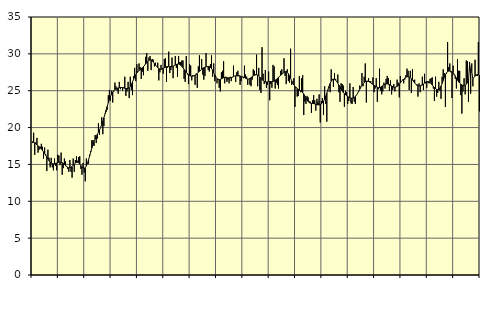
| Category | Piggar | Series 1 |
|---|---|---|
| nan | 17.9 | 18.08 |
| 87.0 | 19.3 | 17.99 |
| 87.0 | 16.3 | 17.92 |
| 87.0 | 18 | 17.77 |
| 87.0 | 18.6 | 17.65 |
| 87.0 | 16.6 | 17.52 |
| 87.0 | 17 | 17.39 |
| 87.0 | 17.4 | 17.25 |
| 87.0 | 17.8 | 17.09 |
| 87.0 | 17.4 | 16.91 |
| 87.0 | 15.8 | 16.71 |
| 87.0 | 17.3 | 16.48 |
| nan | 16.4 | 16.24 |
| 88.0 | 14.1 | 15.98 |
| 88.0 | 17 | 15.72 |
| 88.0 | 15.9 | 15.49 |
| 88.0 | 14.6 | 15.3 |
| 88.0 | 15.9 | 15.17 |
| 88.0 | 14.6 | 15.1 |
| 88.0 | 14.2 | 15.09 |
| 88.0 | 15.8 | 15.1 |
| 88.0 | 14.8 | 15.15 |
| 88.0 | 14.2 | 15.2 |
| 88.0 | 16.3 | 15.26 |
| nan | 16.2 | 15.29 |
| 89.0 | 14.9 | 15.31 |
| 89.0 | 16.6 | 15.29 |
| 89.0 | 13.6 | 15.23 |
| 89.0 | 14.5 | 15.14 |
| 89.0 | 15.8 | 15.01 |
| 89.0 | 15.4 | 14.86 |
| 89.0 | 14.8 | 14.73 |
| 89.0 | 14.4 | 14.61 |
| 89.0 | 14 | 14.54 |
| 89.0 | 15.6 | 14.55 |
| 89.0 | 14 | 14.61 |
| nan | 13.2 | 14.73 |
| 90.0 | 15.8 | 14.88 |
| 90.0 | 14 | 15.05 |
| 90.0 | 15.6 | 15.19 |
| 90.0 | 16.1 | 15.28 |
| 90.0 | 15.5 | 15.3 |
| 90.0 | 16 | 15.22 |
| 90.0 | 16.1 | 15.06 |
| 90.0 | 14.4 | 14.86 |
| 90.0 | 13.6 | 14.66 |
| 90.0 | 15.2 | 14.51 |
| 90.0 | 13.9 | 14.46 |
| nan | 12.7 | 14.56 |
| 91.0 | 15.8 | 14.8 |
| 91.0 | 15.1 | 15.17 |
| 91.0 | 15.1 | 15.64 |
| 91.0 | 16.3 | 16.16 |
| 91.0 | 16.8 | 16.69 |
| 91.0 | 18.3 | 17.21 |
| 91.0 | 18.3 | 17.68 |
| 91.0 | 17.5 | 18.09 |
| 91.0 | 19 | 18.46 |
| 91.0 | 17.9 | 18.79 |
| 91.0 | 18.5 | 19.08 |
| nan | 20.6 | 19.36 |
| 92.0 | 19 | 19.67 |
| 92.0 | 20 | 20.01 |
| 92.0 | 21.4 | 20.41 |
| 92.0 | 19.1 | 20.85 |
| 92.0 | 20.2 | 21.34 |
| 92.0 | 21.9 | 21.84 |
| 92.0 | 22.1 | 22.36 |
| 92.0 | 22.4 | 22.87 |
| 92.0 | 24.4 | 23.36 |
| 92.0 | 25.1 | 23.81 |
| 92.0 | 23.6 | 24.21 |
| nan | 25 | 24.55 |
| 93.0 | 23.4 | 24.81 |
| 93.0 | 24.9 | 25.01 |
| 93.0 | 26.1 | 25.15 |
| 93.0 | 25.6 | 25.24 |
| 93.0 | 25 | 25.32 |
| 93.0 | 24.6 | 25.38 |
| 93.0 | 26.2 | 25.41 |
| 93.0 | 25.2 | 25.44 |
| 93.0 | 25.4 | 25.45 |
| 93.0 | 25 | 25.42 |
| 93.0 | 25.5 | 25.37 |
| nan | 26.9 | 25.32 |
| 94.0 | 24.3 | 25.29 |
| 94.0 | 24.9 | 25.28 |
| 94.0 | 26.2 | 25.32 |
| 94.0 | 24 | 25.41 |
| 94.0 | 26.9 | 25.6 |
| 94.0 | 25.1 | 25.86 |
| 94.0 | 24.4 | 26.18 |
| 94.0 | 27 | 26.53 |
| 94.0 | 28.1 | 26.86 |
| 94.0 | 26.3 | 27.16 |
| 94.0 | 28.6 | 27.41 |
| nan | 27.7 | 27.6 |
| 95.0 | 28.7 | 27.76 |
| 95.0 | 28.2 | 27.88 |
| 95.0 | 26.6 | 28 |
| 95.0 | 27.6 | 28.12 |
| 95.0 | 27.1 | 28.26 |
| 95.0 | 28.5 | 28.43 |
| 95.0 | 29.6 | 28.62 |
| 95.0 | 30.1 | 28.82 |
| 95.0 | 27.7 | 28.99 |
| 95.0 | 29.5 | 29.12 |
| 95.0 | 29.7 | 29.18 |
| nan | 27.8 | 29.16 |
| 96.0 | 29.3 | 29.05 |
| 96.0 | 29.2 | 28.88 |
| 96.0 | 28.3 | 28.67 |
| 96.0 | 28.8 | 28.47 |
| 96.0 | 28.3 | 28.28 |
| 96.0 | 28.8 | 28.13 |
| 96.0 | 26.4 | 28.02 |
| 96.0 | 27.5 | 27.94 |
| 96.0 | 28.5 | 27.92 |
| 96.0 | 27.9 | 27.96 |
| 96.0 | 27.3 | 28.02 |
| nan | 29.3 | 28.09 |
| 97.0 | 29.4 | 28.18 |
| 97.0 | 26.2 | 28.24 |
| 97.0 | 28.1 | 28.29 |
| 97.0 | 30.3 | 28.31 |
| 97.0 | 27.4 | 28.3 |
| 97.0 | 27.8 | 28.28 |
| 97.0 | 29.5 | 28.28 |
| 97.0 | 26.7 | 28.32 |
| 97.0 | 28.4 | 28.39 |
| 97.0 | 29.7 | 28.48 |
| 97.0 | 28.1 | 28.56 |
| nan | 26.9 | 28.62 |
| 98.0 | 29.7 | 28.62 |
| 98.0 | 28.9 | 28.56 |
| 98.0 | 28.9 | 28.46 |
| 98.0 | 29.1 | 28.29 |
| 98.0 | 29.1 | 28.1 |
| 98.0 | 26.6 | 27.89 |
| 98.0 | 26.2 | 27.7 |
| 98.0 | 29.7 | 27.52 |
| 98.0 | 27.2 | 27.36 |
| 98.0 | 25.9 | 27.21 |
| 98.0 | 28.6 | 27.08 |
| nan | 28.4 | 26.99 |
| 99.0 | 26.4 | 26.96 |
| 99.0 | 27.1 | 26.98 |
| 99.0 | 27.1 | 27.03 |
| 99.0 | 25.8 | 27.11 |
| 99.0 | 27.3 | 27.2 |
| 99.0 | 25.4 | 27.33 |
| 99.0 | 28.3 | 27.49 |
| 99.0 | 29.8 | 27.65 |
| 99.0 | 27.7 | 27.8 |
| 99.0 | 29.3 | 27.94 |
| 99.0 | 27.2 | 28.05 |
| nan | 26.5 | 28.13 |
| 0.0 | 27 | 28.19 |
| 0.0 | 30.1 | 28.24 |
| 0.0 | 28.3 | 28.27 |
| 0.0 | 27.8 | 28.29 |
| 0.0 | 27.6 | 28.28 |
| 0.0 | 28.6 | 28.19 |
| 0.0 | 29.8 | 28.02 |
| 0.0 | 26.9 | 27.76 |
| 0.0 | 28.7 | 27.45 |
| 0.0 | 26.3 | 27.13 |
| 0.0 | 26.9 | 26.85 |
| nan | 26 | 26.65 |
| 1.0 | 26.6 | 26.54 |
| 1.0 | 25.4 | 26.51 |
| 1.0 | 24.9 | 26.54 |
| 1.0 | 27.5 | 26.61 |
| 1.0 | 27.7 | 26.69 |
| 1.0 | 29 | 26.76 |
| 1.0 | 26 | 26.8 |
| 1.0 | 26.9 | 26.8 |
| 1.0 | 26.2 | 26.77 |
| 1.0 | 26.5 | 26.74 |
| 1.0 | 26 | 26.72 |
| nan | 26.9 | 26.74 |
| 2.0 | 26.3 | 26.79 |
| 2.0 | 26.8 | 26.85 |
| 2.0 | 28.4 | 26.93 |
| 2.0 | 27 | 26.99 |
| 2.0 | 26.2 | 27.02 |
| 2.0 | 27.5 | 27.03 |
| 2.0 | 27.7 | 27.01 |
| 2.0 | 27.1 | 27 |
| 2.0 | 25.8 | 26.98 |
| 2.0 | 26.3 | 26.95 |
| 2.0 | 26.9 | 26.91 |
| nan | 26.7 | 26.85 |
| 3.0 | 28.4 | 26.77 |
| 3.0 | 27.2 | 26.69 |
| 3.0 | 26.9 | 26.61 |
| 3.0 | 25.8 | 26.57 |
| 3.0 | 26.6 | 26.59 |
| 3.0 | 25.8 | 26.67 |
| 3.0 | 25.6 | 26.77 |
| 3.0 | 26.5 | 26.89 |
| 3.0 | 27.9 | 27.01 |
| 3.0 | 27.7 | 27.11 |
| 3.0 | 27.1 | 27.17 |
| nan | 29.9 | 27.17 |
| 4.0 | 25.6 | 27.11 |
| 4.0 | 28.1 | 27 |
| 4.0 | 25.1 | 26.86 |
| 4.0 | 24.7 | 26.69 |
| 4.0 | 30.9 | 26.52 |
| 4.0 | 27.3 | 26.37 |
| 4.0 | 25.9 | 26.26 |
| 4.0 | 27.8 | 26.2 |
| 4.0 | 25.4 | 26.19 |
| 4.0 | 25.8 | 26.2 |
| 4.0 | 27.6 | 26.23 |
| nan | 23.7 | 26.24 |
| 5.0 | 25.9 | 26.24 |
| 5.0 | 25.4 | 26.24 |
| 5.0 | 28.5 | 26.25 |
| 5.0 | 28.3 | 26.31 |
| 5.0 | 25.3 | 26.4 |
| 5.0 | 26.1 | 26.52 |
| 5.0 | 25.8 | 26.67 |
| 5.0 | 25.3 | 26.81 |
| 5.0 | 27 | 26.95 |
| 5.0 | 27.7 | 27.1 |
| 5.0 | 27.9 | 27.23 |
| nan | 27.4 | 27.37 |
| 6.0 | 29.4 | 27.5 |
| 6.0 | 27 | 27.59 |
| 6.0 | 25.9 | 27.6 |
| 6.0 | 27.9 | 27.5 |
| 6.0 | 26.3 | 27.3 |
| 6.0 | 26.1 | 27.03 |
| 6.0 | 30.7 | 26.7 |
| 6.0 | 25.8 | 26.36 |
| 6.0 | 26 | 26.06 |
| 6.0 | 26.7 | 25.8 |
| 6.0 | 22.8 | 25.58 |
| nan | 25.5 | 25.41 |
| 7.0 | 24.2 | 25.28 |
| 7.0 | 24.3 | 25.17 |
| 7.0 | 27 | 25.08 |
| 7.0 | 24.8 | 25.01 |
| 7.0 | 26.7 | 24.9 |
| 7.0 | 27.1 | 24.75 |
| 7.0 | 21.7 | 24.54 |
| 7.0 | 23.5 | 24.28 |
| 7.0 | 23.2 | 24.02 |
| 7.0 | 24.3 | 23.75 |
| 7.0 | 24.1 | 23.54 |
| nan | 23.6 | 23.4 |
| 8.0 | 23.5 | 23.32 |
| 8.0 | 22 | 23.29 |
| 8.0 | 23.7 | 23.27 |
| 8.0 | 24.4 | 23.25 |
| 8.0 | 23.7 | 23.21 |
| 8.0 | 22.3 | 23.16 |
| 8.0 | 23.9 | 23.1 |
| 8.0 | 23.5 | 23.08 |
| 8.0 | 24.5 | 23.08 |
| 8.0 | 20.7 | 23.1 |
| 8.0 | 23.6 | 23.19 |
| nan | 24 | 23.33 |
| 9.0 | 21.7 | 23.56 |
| 9.0 | 25.6 | 23.87 |
| 9.0 | 23.2 | 24.25 |
| 9.0 | 20.8 | 24.67 |
| 9.0 | 24.9 | 25.13 |
| 9.0 | 25.4 | 25.58 |
| 9.0 | 24.8 | 25.98 |
| 9.0 | 27.9 | 26.28 |
| 9.0 | 26.6 | 26.48 |
| 9.0 | 25.5 | 26.56 |
| 9.0 | 27.4 | 26.55 |
| nan | 26.6 | 26.44 |
| 10.0 | 26.2 | 26.26 |
| 10.0 | 27.2 | 26.03 |
| 10.0 | 24.8 | 25.76 |
| 10.0 | 23.5 | 25.48 |
| 10.0 | 26 | 25.22 |
| 10.0 | 25.9 | 24.98 |
| 10.0 | 25.7 | 24.77 |
| 10.0 | 22.8 | 24.6 |
| 10.0 | 25 | 24.45 |
| 10.0 | 24.8 | 24.33 |
| 10.0 | 23.2 | 24.22 |
| nan | 23.6 | 24.12 |
| 11.0 | 26 | 24.04 |
| 11.0 | 23.3 | 23.99 |
| 11.0 | 23.2 | 23.98 |
| 11.0 | 25.5 | 24.01 |
| 11.0 | 23.5 | 24.09 |
| 11.0 | 23.2 | 24.22 |
| 11.0 | 24.4 | 24.41 |
| 11.0 | 24.6 | 24.64 |
| 11.0 | 25 | 24.91 |
| 11.0 | 25.7 | 25.2 |
| 11.0 | 25.5 | 25.48 |
| nan | 27.4 | 25.73 |
| 12.0 | 25.6 | 25.95 |
| 12.0 | 26.9 | 26.12 |
| 12.0 | 28.7 | 26.23 |
| 12.0 | 23.4 | 26.3 |
| 12.0 | 26.2 | 26.3 |
| 12.0 | 26.7 | 26.25 |
| 12.0 | 26.3 | 26.18 |
| 12.0 | 26.3 | 26.08 |
| 12.0 | 25.9 | 25.97 |
| 12.0 | 26.8 | 25.86 |
| 12.0 | 24.8 | 25.75 |
| nan | 25.3 | 25.65 |
| 13.0 | 26.7 | 25.55 |
| 13.0 | 23.5 | 25.47 |
| 13.0 | 25.2 | 25.41 |
| 13.0 | 28 | 25.41 |
| 13.0 | 25 | 25.47 |
| 13.0 | 24.5 | 25.57 |
| 13.0 | 24.9 | 25.68 |
| 13.0 | 26.1 | 25.8 |
| 13.0 | 25.3 | 25.88 |
| 13.0 | 26.6 | 25.92 |
| 13.0 | 27 | 25.92 |
| nan | 26.7 | 25.89 |
| 14.0 | 25 | 25.83 |
| 14.0 | 26.4 | 25.74 |
| 14.0 | 24.5 | 25.65 |
| 14.0 | 25.1 | 25.56 |
| 14.0 | 25.9 | 25.49 |
| 14.0 | 24.9 | 25.47 |
| 14.0 | 25.5 | 25.5 |
| 14.0 | 26.5 | 25.58 |
| 14.0 | 26.1 | 25.72 |
| 14.0 | 24.1 | 25.89 |
| 14.0 | 27 | 26.08 |
| nan | 26.3 | 26.27 |
| 15.0 | 26.5 | 26.44 |
| 15.0 | 26 | 26.59 |
| 15.0 | 26.5 | 26.72 |
| 15.0 | 27.1 | 26.83 |
| 15.0 | 28 | 26.89 |
| 15.0 | 27.7 | 26.91 |
| 15.0 | 25.1 | 26.87 |
| 15.0 | 27.7 | 26.78 |
| 15.0 | 24.7 | 26.63 |
| 15.0 | 27.9 | 26.45 |
| 15.0 | 26.4 | 26.25 |
| nan | 26.5 | 26.05 |
| 16.0 | 25.9 | 25.88 |
| 16.0 | 25.9 | 25.75 |
| 16.0 | 24.2 | 25.68 |
| 16.0 | 26 | 25.65 |
| 16.0 | 24.8 | 25.65 |
| 16.0 | 25.8 | 25.69 |
| 16.0 | 26.9 | 25.79 |
| 16.0 | 25.1 | 25.91 |
| 16.0 | 27.3 | 26.04 |
| 16.0 | 26 | 26.16 |
| 16.0 | 25.4 | 26.24 |
| nan | 26.1 | 26.25 |
| 17.0 | 26 | 26.21 |
| 17.0 | 26.6 | 26.11 |
| 17.0 | 26.7 | 25.96 |
| 17.0 | 26.8 | 25.78 |
| 17.0 | 25.3 | 25.59 |
| 17.0 | 23.6 | 25.43 |
| 17.0 | 26.9 | 25.29 |
| 17.0 | 24.2 | 25.18 |
| 17.0 | 24.7 | 25.14 |
| 17.0 | 26.2 | 25.18 |
| 17.0 | 25 | 25.34 |
| nan | 23.9 | 25.63 |
| 18.0 | 26.9 | 25.99 |
| 18.0 | 27.9 | 26.4 |
| 18.0 | 27.4 | 26.8 |
| 18.0 | 22.8 | 27.16 |
| 18.0 | 27.3 | 27.42 |
| 18.0 | 31.6 | 27.59 |
| 18.0 | 28.2 | 27.66 |
| 18.0 | 28.7 | 27.67 |
| 18.0 | 27.5 | 27.63 |
| 18.0 | 24 | 27.55 |
| 18.0 | 28.4 | 27.42 |
| nan | 27.1 | 27.24 |
| 19.0 | 26.6 | 27 |
| 19.0 | 25.3 | 26.72 |
| 19.0 | 29.3 | 26.44 |
| 19.0 | 27.7 | 26.21 |
| 19.0 | 27.7 | 26.04 |
| 19.0 | 24.4 | 25.9 |
| 19.0 | 21.9 | 25.78 |
| 19.0 | 24.9 | 25.7 |
| 19.0 | 26.7 | 25.68 |
| 19.0 | 24.5 | 25.74 |
| 19.0 | 29.1 | 25.87 |
| nan | 29 | 26.07 |
| 20.0 | 23.5 | 26.34 |
| 20.0 | 28.9 | 28.56 |
| 20.0 | 24.6 | 27.35 |
| 20.0 | 28.7 | 27.62 |
| 20.0 | 25.6 | 26.61 |
| 20.0 | 26.8 | 26.81 |
| 20.0 | 29.2 | 26.99 |
| 20.0 | 27 | 27.13 |
| 20.0 | 27 | 27.2 |
| 20.0 | 31.6 | 27.19 |
| 20.0 | 22.2 | 27.11 |